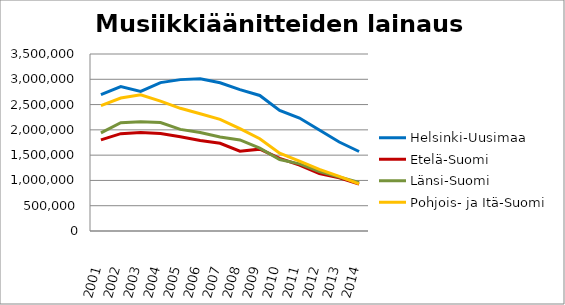
| Category | Helsinki-Uusimaa | Etelä-Suomi | Länsi-Suomi | Pohjois- ja Itä-Suomi |
|---|---|---|---|---|
| 2001.0 | 2696361 | 1800931 | 1940809 | 2479763 |
| 2002.0 | 2854284 | 1925080 | 2141670 | 2629184 |
| 2003.0 | 2759467 | 1947312 | 2162236 | 2692857 |
| 2004.0 | 2934216 | 1926916 | 2144012 | 2568238 |
| 2005.0 | 2993315 | 1864495 | 2009366 | 2425986 |
| 2006.0 | 3009989 | 1788864 | 1947692 | 2318985 |
| 2007.0 | 2930701 | 1735189 | 1858339 | 2207657 |
| 2008.0 | 2796675 | 1576789 | 1800640 | 2023267 |
| 2009.0 | 2679962 | 1618331 | 1637758 | 1824190 |
| 2010.0 | 2383499 | 1434530 | 1413599 | 1537268 |
| 2011.0 | 2234773 | 1304858 | 1327528 | 1379912 |
| 2012.0 | 1997106 | 1137568 | 1177181 | 1217756 |
| 2013.0 | 1759587 | 1052886 | 1068059 | 1081777 |
| 2014.0 | 1572079 | 928158 | 960220 | 930112 |